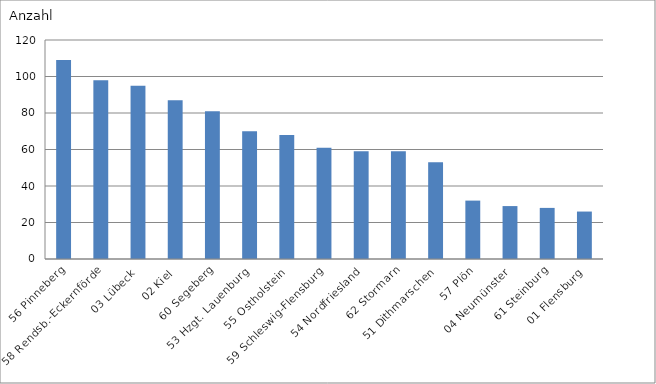
| Category | 56 Pinneberg |
|---|---|
| 56 Pinneberg | 109 |
| 58 Rendsb.-Eckernförde | 98 |
| 03 Lübeck | 95 |
| 02 Kiel | 87 |
| 60 Segeberg | 81 |
| 53 Hzgt. Lauenburg | 70 |
| 55 Ostholstein | 68 |
| 59 Schleswig-Flensburg | 61 |
| 54 Nordfriesland | 59 |
| 62 Stormarn | 59 |
| 51 Dithmarschen | 53 |
| 57 Plön | 32 |
| 04 Neumünster | 29 |
| 61 Steinburg | 28 |
| 01 Flensburg | 26 |